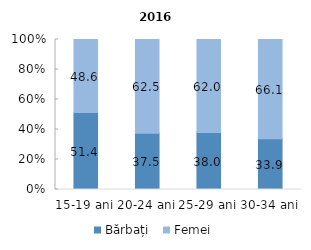
| Category | Bărbați  | Femei |
|---|---|---|
| 15-19 ani | 51.4 | 48.6 |
| 20-24 ani | 37.5 | 62.5 |
| 25-29 ani | 38 | 62 |
| 30-34 ani | 33.9 | 66.1 |